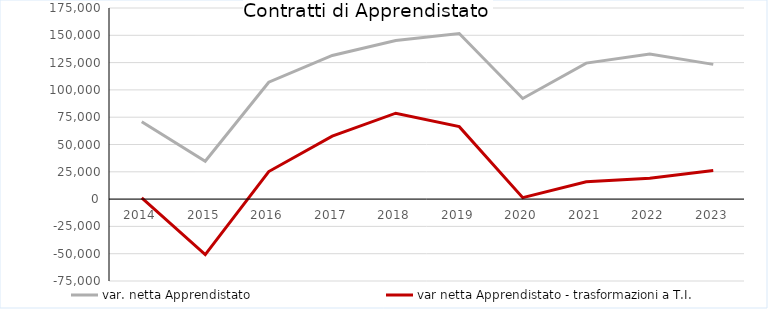
| Category | var. netta Apprendistato | var netta Apprendistato - trasformazioni a T.I. |
|---|---|---|
| 2014.0 | 70777 | 1150 |
| 2015.0 | 34686 | -50805 |
| 2016.0 | 107053 | 25233 |
| 2017.0 | 131572 | 57648 |
| 2018.0 | 145148 | 78655 |
| 2019.0 | 151597 | 66365 |
| 2020.0 | 92156 | 1315 |
| 2021.0 | 124560 | 15803 |
| 2022.0 | 132839 | 19092 |
| 2023.0 | 123363 | 26198 |